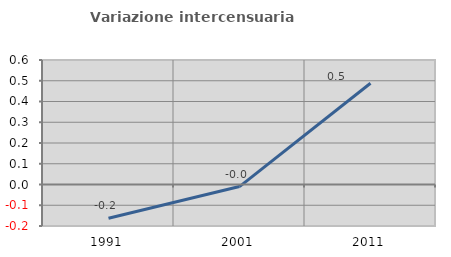
| Category | Variazione intercensuaria annua |
|---|---|
| 1991.0 | -0.162 |
| 2001.0 | -0.01 |
| 2011.0 | 0.488 |